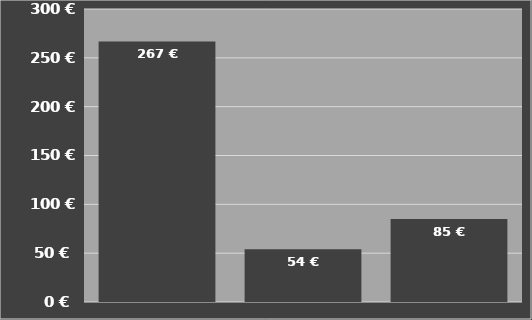
| Category | Kosten je Stunde |
|---|---|
| Krone BigX 850
EasyCollect 750-2 (Mais) | 266.822 |
| Easy Flow 300 S
Pickup 2,8 Meter | 54.051 |